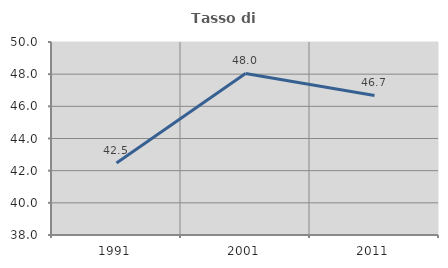
| Category | Tasso di occupazione   |
|---|---|
| 1991.0 | 42.478 |
| 2001.0 | 48.045 |
| 2011.0 | 46.679 |